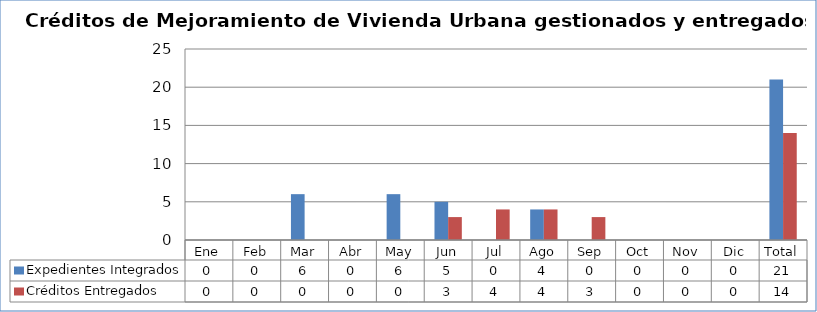
| Category | Expedientes Integrados | Créditos Entregados |
|---|---|---|
| Ene | 0 | 0 |
| Feb | 0 | 0 |
| Mar | 6 | 0 |
| Abr | 0 | 0 |
| May | 6 | 0 |
| Jun | 5 | 3 |
| Jul | 0 | 4 |
| Ago | 4 | 4 |
| Sep | 0 | 3 |
| Oct | 0 | 0 |
| Nov | 0 | 0 |
| Dic | 0 | 0 |
| Total | 21 | 14 |